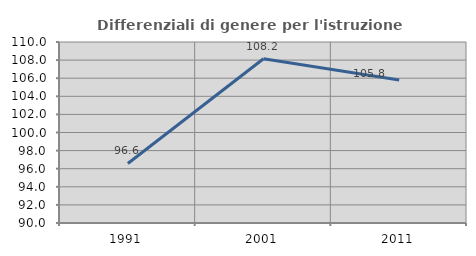
| Category | Differenziali di genere per l'istruzione superiore |
|---|---|
| 1991.0 | 96.58 |
| 2001.0 | 108.152 |
| 2011.0 | 105.79 |